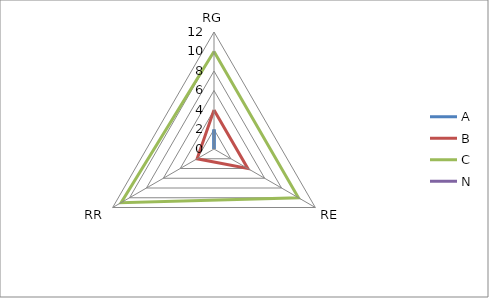
| Category | A | B | C | N |
|---|---|---|---|---|
| 0 | 2 | 4 | 10 | 0 |
| 1 | 0 | 4 | 10 | 0 |
| 2 | 0 | 2 | 11 | 0 |